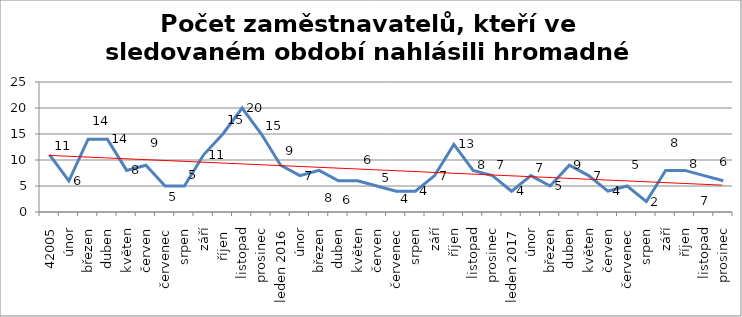
| Category | Series 0 |
|---|---|
| 42005 | 11 |
| únor | 6 |
| březen | 14 |
| duben | 14 |
| květen | 8 |
| červen | 9 |
| červenec | 5 |
| srpen | 5 |
| září | 11 |
| říjen  | 15 |
| listopad | 20 |
| prosinec | 15 |
|  leden 2016 | 9 |
| únor | 7 |
| březen | 8 |
| duben | 6 |
| květen | 6 |
| červen | 5 |
| červenec | 4 |
| srpen | 4 |
| září | 7 |
| říjen | 13 |
| listopad | 8 |
| prosinec | 7 |
|  leden 2017 | 4 |
| únor | 7 |
| březen | 5 |
| duben | 9 |
| květen | 7 |
| červen | 4 |
| červenec | 5 |
| srpen | 2 |
| září | 8 |
| říjen | 8 |
| listopad | 7 |
| prosinec | 6 |